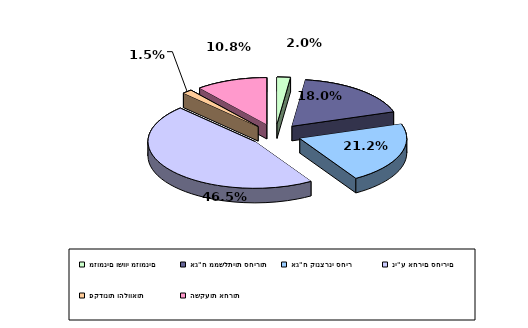
| Category | Series 0 |
|---|---|
| מזומנים ושווי מזומנים | 0.02 |
| אג"ח ממשלתיות סחירות | 0.18 |
| אג"ח קונצרני סחיר | 0.212 |
| ני"ע אחרים סחירים | 0.465 |
| פקדונות והלוואות | 0.015 |
| השקעות אחרות | 0.108 |